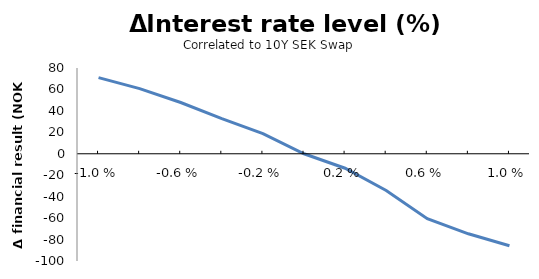
| Category | Series 0 |
|---|---|
| -0.01 | 71.059 |
| -0.008 | 60.738 |
| -0.006 | 47.806 |
| -0.004 | 32.754 |
| -0.002 | 18.844 |
| 0.0 | 0 |
| 0.002 | -13.495 |
| 0.004 | -34.24 |
| 0.006 | -60.469 |
| 0.008 | -74.645 |
| 0.01 | -85.784 |